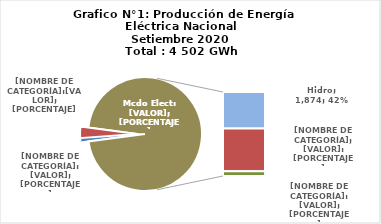
| Category | Series 0 |
|---|---|
| 0 | 42.199 |
| 1 | 145.353 |
| 2 | 1873.583 |
| 3 | 2197.065 |
| 4 | 244.038 |